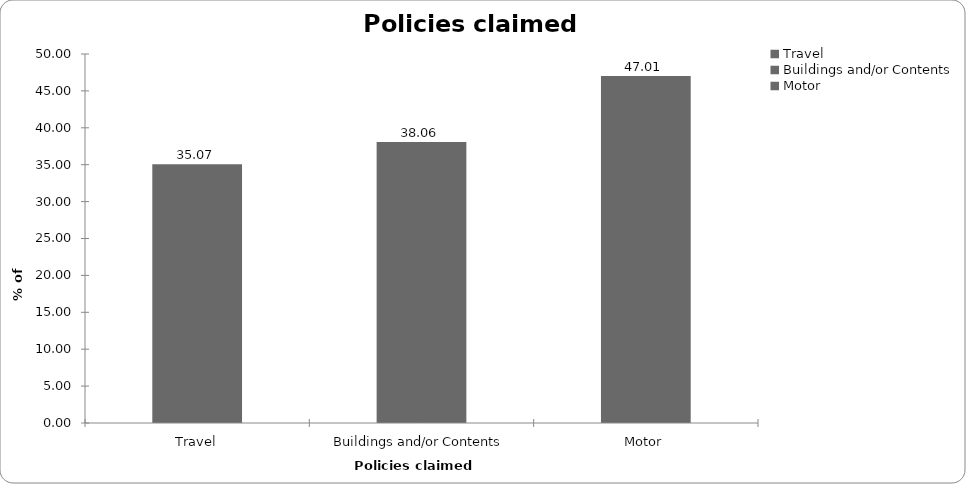
| Category | Policies claimed on |
|---|---|
| Travel | 35.075 |
| Buildings and/or Contents | 38.06 |
| Motor | 47.015 |